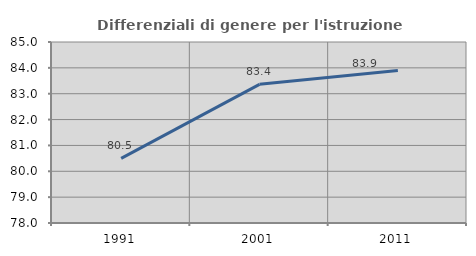
| Category | Differenziali di genere per l'istruzione superiore |
|---|---|
| 1991.0 | 80.5 |
| 2001.0 | 83.363 |
| 2011.0 | 83.897 |